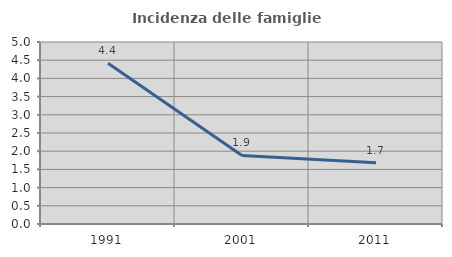
| Category | Incidenza delle famiglie numerose |
|---|---|
| 1991.0 | 4.414 |
| 2001.0 | 1.883 |
| 2011.0 | 1.682 |